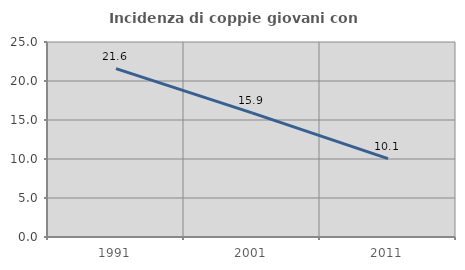
| Category | Incidenza di coppie giovani con figli |
|---|---|
| 1991.0 | 21.587 |
| 2001.0 | 15.916 |
| 2011.0 | 10.051 |